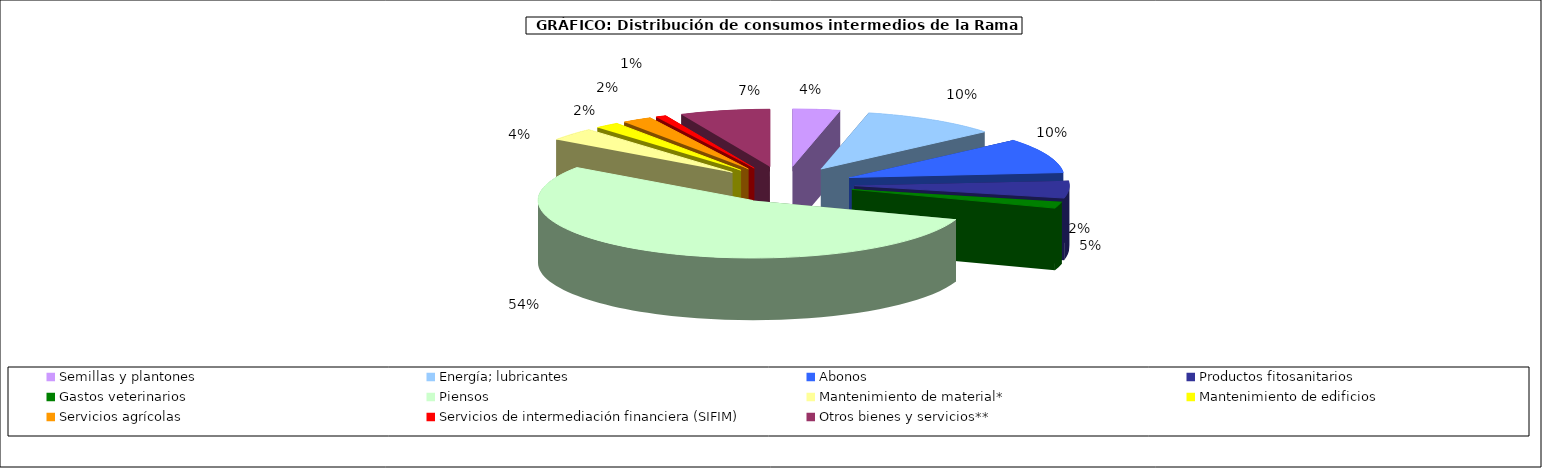
| Category | Consumos Intermedios |
|---|---|
| Semillas y plantones  | 3.561 |
| Energía; lubricantes | 10.221 |
| Abonos | 9.844 |
| Productos fitosanitarios | 4.847 |
| Gastos veterinarios | 1.829 |
| Piensos | 54.418 |
| Mantenimiento de material* | 3.642 |
| Mantenimiento de edificios | 1.832 |
| Servicios agrícolas | 2.248 |
| Servicios de intermediación financiera (SIFIM) | 0.798 |
| Otros bienes y servicios** | 6.762 |